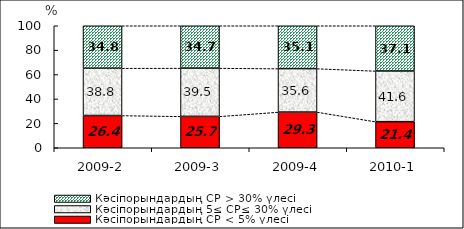
| Category | Кәсіпорындардың СР < 5% үлесі | Кәсіпорындардың 5≤ СР≤ 30% үлесі | Кәсіпорындардың СР > 30% үлесі |
|---|---|---|---|
| 2009-2 | 26.434 | 38.769 | 34.797 |
| 2009-3 | 25.743 | 39.532 | 34.725 |
| 2009-4 | 29.26 | 35.611 | 35.129 |
| 2010-1 | 21.368 | 41.56 | 37.073 |